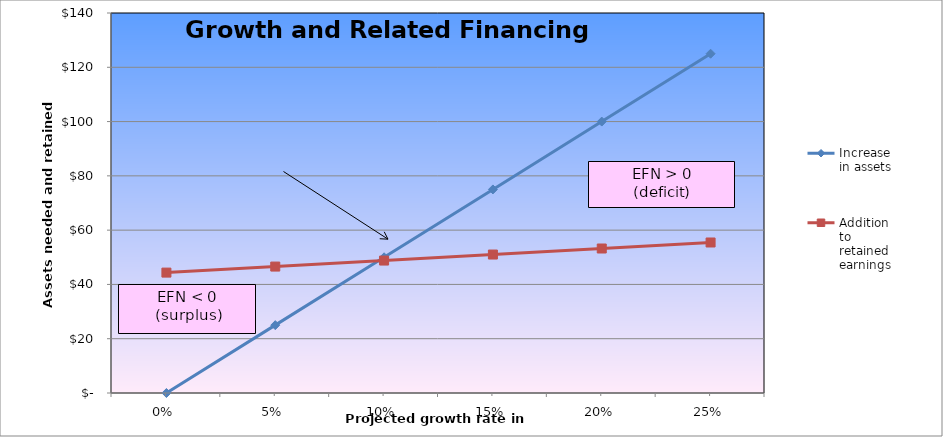
| Category | Increase
in assets | Addition
to
retained
earnings |
|---|---|---|
| 0.0 | 0 | 44.36 |
| 0.05 | 25 | 46.578 |
| 0.1 | 50 | 48.796 |
| 0.15 | 75 | 51.014 |
| 0.2 | 100 | 53.232 |
| 0.25 | 125 | 55.45 |